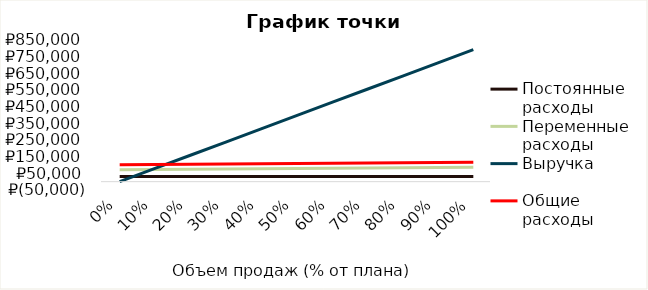
| Category | Постоянные расходы | Переменные расходы | Выручка | Общие расходы |
|---|---|---|---|---|
| 0.0 | 30618.819 | 71065.164 | 0 | 101683.984 |
| 0.1 | 30618.819 | 72609.79 | 79211.581 | 103228.61 |
| 0.2 | 30618.819 | 74154.416 | 158423.161 | 104773.235 |
| 0.30000000000000004 | 30618.819 | 75699.042 | 237634.742 | 106317.861 |
| 0.4 | 30618.819 | 77243.668 | 316846.323 | 107862.487 |
| 0.5 | 30618.819 | 78788.293 | 396057.903 | 109407.113 |
| 0.6 | 30618.819 | 80332.919 | 475269.484 | 110951.739 |
| 0.7 | 30618.819 | 81877.545 | 554481.065 | 112496.365 |
| 0.7999999999999999 | 30618.819 | 83422.171 | 633692.645 | 114040.99 |
| 0.8999999999999999 | 30618.819 | 84966.797 | 712904.226 | 115585.616 |
| 0.9999999999999999 | 30618.819 | 86511.423 | 792115.807 | 117130.242 |